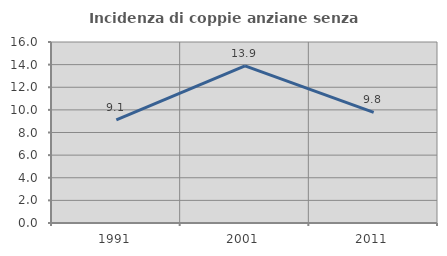
| Category | Incidenza di coppie anziane senza figli  |
|---|---|
| 1991.0 | 9.118 |
| 2001.0 | 13.889 |
| 2011.0 | 9.771 |